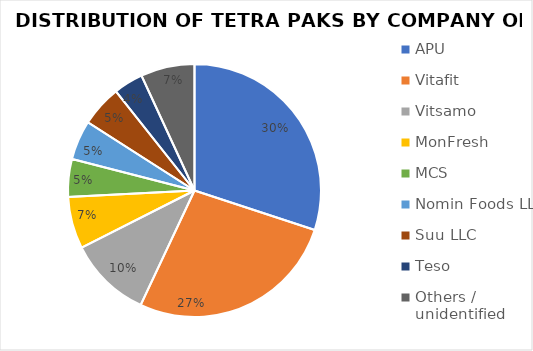
| Category | Series 0 |
|---|---|
| APU | 262 |
| Vitafit | 235 |
| Vitsamo | 92 |
| MonFresh | 58 |
| MCS | 42 |
| Nomin Foods LLC | 44 |
| Suu LLC | 46 |
| Teso | 33 |
| Others / unidentified | 60 |